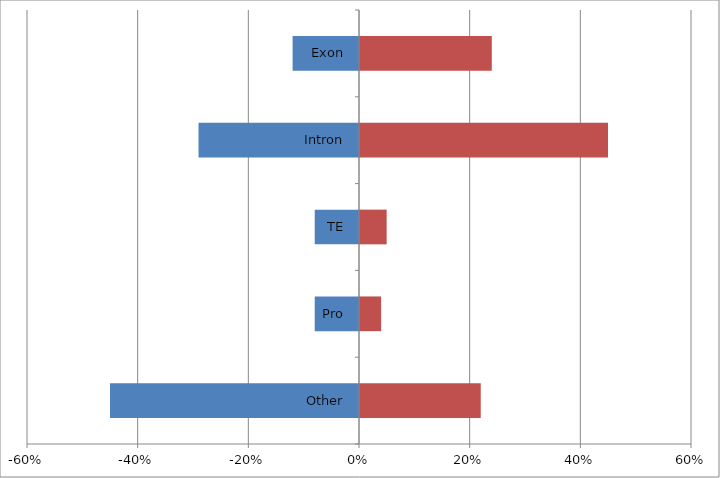
| Category | all CG | methylated |
|---|---|---|
| Other | -0.45 | 0.22 |
| Pro | -0.08 | 0.04 |
| TE | -0.08 | 0.05 |
| Intron | -0.29 | 0.45 |
| Exon | -0.12 | 0.24 |